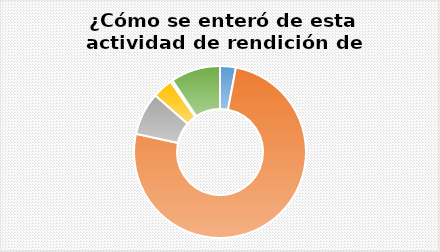
| Category | totales |
|---|---|
| Canales de atención al usuario de la SSPD | 7 |
| Correo electrónico | 178 |
| Portal web | 19 |
| Redes Sociales | 9 |
| Prensa | 1 |
| otros | 22 |